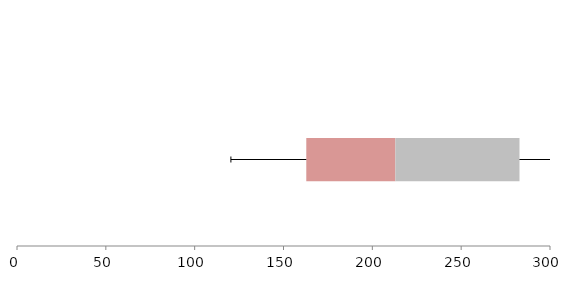
| Category | Series 1 | Series 2 | Series 3 |
|---|---|---|---|
| 0 | 162.826 | 50.133 | 69.868 |